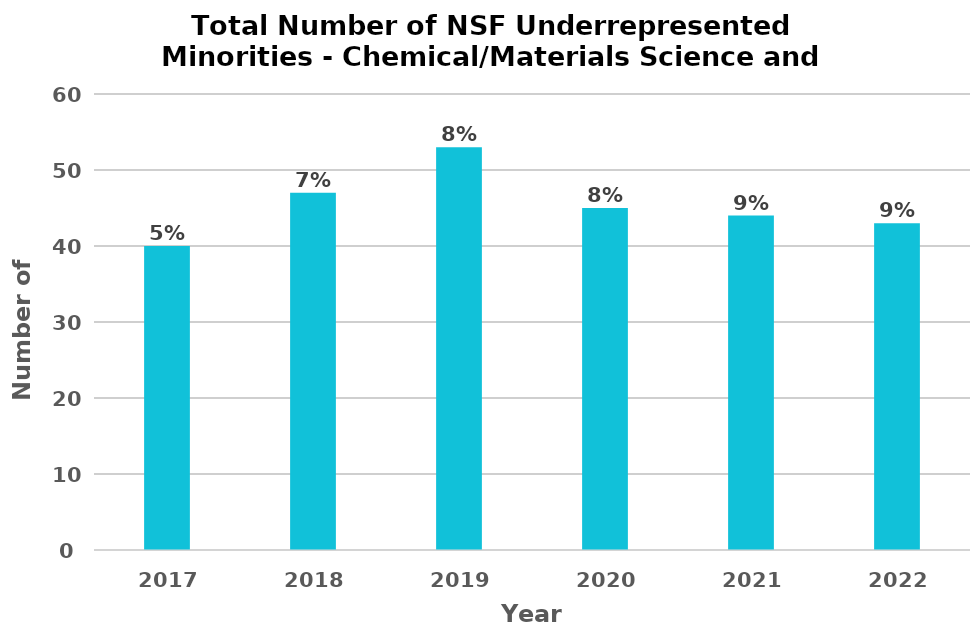
| Category | NSF Underrepresented Group |
|---|---|
| 2017.0 | 40 |
| 2018.0 | 47 |
| 2019.0 | 53 |
| 2020.0 | 45 |
| 2021.0 | 44 |
| 2022.0 | 43 |